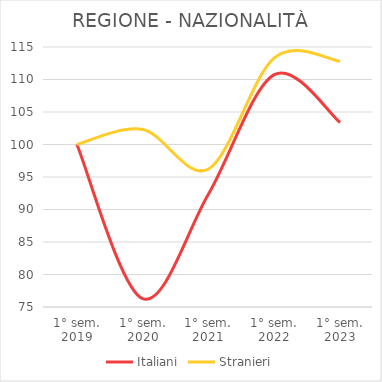
| Category | Italiani | Stranieri |
|---|---|---|
| 1° sem.
2019 | 100 | 100 |
| 1° sem.
2020 | 76.276 | 102.319 |
| 1° sem.
2021 | 92.377 | 96.232 |
| 1° sem.
2022 | 110.748 | 113.337 |
| 1° sem.
2023 | 103.376 | 112.817 |